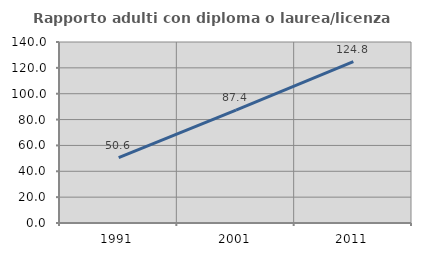
| Category | Rapporto adulti con diploma o laurea/licenza media  |
|---|---|
| 1991.0 | 50.602 |
| 2001.0 | 87.356 |
| 2011.0 | 124.786 |